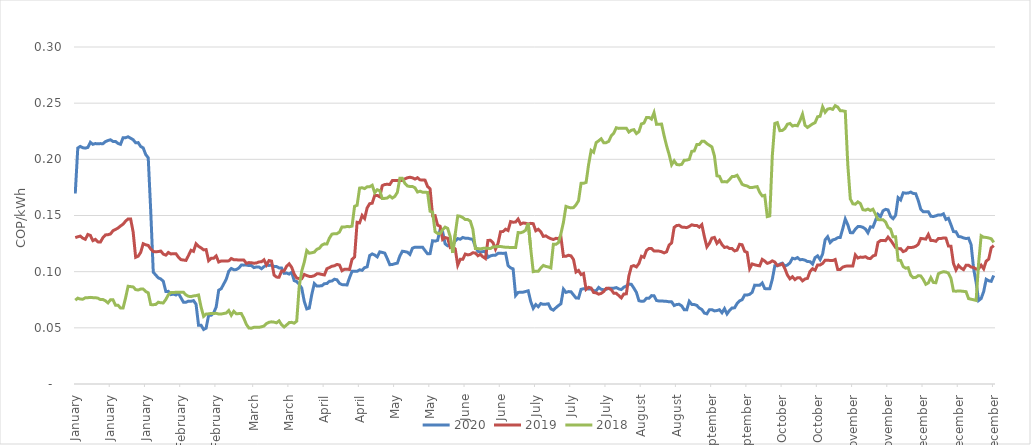
| Category | 2020 | 2019 | 2018 |
|---|---|---|---|
| 1900-01-01 | 0.17 | 0.13 | 0.075 |
| 1900-01-02 | 0.21 | 0.131 | 0.076 |
| 1900-01-03 | 0.212 | 0.132 | 0.076 |
| 1900-01-04 | 0.21 | 0.13 | 0.075 |
| 1900-01-05 | 0.21 | 0.129 | 0.077 |
| 1900-01-06 | 0.211 | 0.133 | 0.077 |
| 1900-01-07 | 0.215 | 0.132 | 0.077 |
| 1900-01-08 | 0.213 | 0.128 | 0.077 |
| 1900-01-09 | 0.214 | 0.129 | 0.077 |
| 1900-01-10 | 0.214 | 0.127 | 0.076 |
| 1900-01-11 | 0.214 | 0.126 | 0.075 |
| 1900-01-12 | 0.214 | 0.13 | 0.075 |
| 1900-01-13 | 0.216 | 0.133 | 0.074 |
| 1900-01-14 | 0.217 | 0.133 | 0.072 |
| 1900-01-15 | 0.217 | 0.134 | 0.075 |
| 1900-01-16 | 0.216 | 0.136 | 0.075 |
| 1900-01-17 | 0.216 | 0.138 | 0.07 |
| 1900-01-18 | 0.214 | 0.139 | 0.07 |
| 1900-01-19 | 0.213 | 0.141 | 0.068 |
| 1900-01-20 | 0.219 | 0.142 | 0.068 |
| 1900-01-21 | 0.219 | 0.145 | 0.077 |
| 1900-01-22 | 0.22 | 0.147 | 0.087 |
| 1900-01-23 | 0.219 | 0.147 | 0.087 |
| 1900-01-24 | 0.217 | 0.135 | 0.086 |
| 1900-01-25 | 0.215 | 0.113 | 0.084 |
| 1900-01-26 | 0.215 | 0.114 | 0.084 |
| 1900-01-27 | 0.211 | 0.117 | 0.084 |
| 1900-01-28 | 0.21 | 0.125 | 0.084 |
| 1900-01-29 | 0.204 | 0.124 | 0.082 |
| 1900-01-30 | 0.201 | 0.123 | 0.081 |
| 1900-01-31 | 0.154 | 0.12 | 0.071 |
| 1900-02-01 | 0.1 | 0.118 | 0.071 |
| 1900-02-02 | 0.097 | 0.118 | 0.071 |
| 1900-02-03 | 0.094 | 0.118 | 0.073 |
| 1900-02-04 | 0.093 | 0.118 | 0.072 |
| 1900-02-05 | 0.091 | 0.116 | 0.072 |
| 1900-02-06 | 0.082 | 0.115 | 0.075 |
| 1900-02-07 | 0.082 | 0.117 | 0.08 |
| 1900-02-08 | 0.08 | 0.116 | 0.081 |
| 1900-02-09 | 0.08 | 0.116 | 0.081 |
| 1900-02-10 | 0.079 | 0.116 | 0.082 |
| 1900-02-11 | 0.081 | 0.113 | 0.082 |
| 1900-02-12 | 0.077 | 0.111 | 0.082 |
| 1900-02-13 | 0.073 | 0.11 | 0.082 |
| 1900-02-14 | 0.073 | 0.11 | 0.079 |
| 1900-02-15 | 0.074 | 0.114 | 0.078 |
| 1900-02-16 | 0.074 | 0.119 | 0.078 |
| 1900-02-17 | 0.074 | 0.118 | 0.078 |
| 1900-02-18 | 0.071 | 0.125 | 0.079 |
| 1900-02-19 | 0.052 | 0.123 | 0.079 |
| 1900-02-20 | 0.052 | 0.121 | 0.068 |
| 1900-02-21 | 0.049 | 0.119 | 0.06 |
| 1900-02-22 | 0.05 | 0.12 | 0.062 |
| 1900-02-23 | 0.061 | 0.11 | 0.062 |
| 1900-02-24 | 0.061 | 0.112 | 0.063 |
| 1900-02-25 | 0.063 | 0.112 | 0.063 |
| 1900-02-26 | 0.069 | 0.114 | 0.063 |
| 1900-02-27 | 0.083 | 0.109 | 0.062 |
| 1900-02-28 | 0.085 | 0.109 | 0.062 |
| 1900-03-01 | 0.093 | 0.11 | 0.063 |
| 1900-03-02 | 0.1 | 0.11 | 0.065 |
| 1900-03-03 | 0.103 | 0.112 | 0.061 |
| 1900-03-04 | 0.102 | 0.111 | 0.065 |
| 1900-03-05 | 0.102 | 0.111 | 0.063 |
| 1900-03-06 | 0.103 | 0.11 | 0.063 |
| 1900-03-07 | 0.106 | 0.11 | 0.063 |
| 1900-03-08 | 0.106 | 0.11 | 0.058 |
| 1900-03-09 | 0.106 | 0.107 | 0.053 |
| 1900-03-10 | 0.105 | 0.108 | 0.05 |
| 1900-03-11 | 0.105 | 0.108 | 0.05 |
| 1900-03-12 | 0.104 | 0.108 | 0.05 |
| 1900-03-13 | 0.104 | 0.108 | 0.05 |
| 1900-03-14 | 0.104 | 0.109 | 0.05 |
| 1900-03-15 | 0.103 | 0.109 | 0.051 |
| 1900-03-16 | 0.104 | 0.111 | 0.052 |
| 1900-03-17 | 0.106 | 0.106 | 0.054 |
| 1900-03-18 | 0.106 | 0.11 | 0.055 |
| 1900-03-19 | 0.106 | 0.109 | 0.055 |
| 1900-03-20 | 0.105 | 0.097 | 0.055 |
| 1900-03-21 | 0.105 | 0.095 | 0.054 |
| 1900-03-22 | 0.103 | 0.095 | 0.056 |
| 1900-03-23 | 0.103 | 0.101 | 0.053 |
| 1900-03-24 | 0.099 | 0.101 | 0.051 |
| 1900-03-25 | 0.099 | 0.105 | 0.053 |
| 1900-03-26 | 0.098 | 0.107 | 0.055 |
| 1900-03-27 | 0.099 | 0.104 | 0.055 |
| 1900-03-28 | 0.092 | 0.098 | 0.054 |
| 1900-03-29 | 0.091 | 0.094 | 0.056 |
| 1900-03-30 | 0.089 | 0.094 | 0.087 |
| 1900-03-31 | 0.085 | 0.094 | 0.1 |
| 1900-04-01 | 0.074 | 0.098 | 0.108 |
| 1900-04-02 | 0.067 | 0.097 | 0.119 |
| 1900-04-03 | 0.068 | 0.096 | 0.116 |
| 1900-04-04 | 0.08 | 0.096 | 0.117 |
| 1900-04-05 | 0.089 | 0.096 | 0.117 |
| 1900-04-06 | 0.087 | 0.098 | 0.12 |
| 1900-04-07 | 0.087 | 0.098 | 0.121 |
| 1900-04-08 | 0.087 | 0.098 | 0.124 |
| 1900-04-09 | 0.089 | 0.097 | 0.125 |
| 1900-04-10 | 0.089 | 0.103 | 0.125 |
| 1900-04-11 | 0.091 | 0.104 | 0.13 |
| 1900-04-12 | 0.092 | 0.105 | 0.133 |
| 1900-04-13 | 0.093 | 0.105 | 0.134 |
| 1900-04-14 | 0.093 | 0.106 | 0.134 |
| 1900-04-15 | 0.09 | 0.106 | 0.135 |
| 1900-04-16 | 0.088 | 0.101 | 0.14 |
| 1900-04-17 | 0.088 | 0.102 | 0.14 |
| 1900-04-18 | 0.088 | 0.102 | 0.14 |
| 1900-04-19 | 0.095 | 0.102 | 0.14 |
| 1900-04-20 | 0.1 | 0.111 | 0.141 |
| 1900-04-21 | 0.1 | 0.113 | 0.158 |
| 1900-04-22 | 0.1 | 0.144 | 0.159 |
| 1900-04-23 | 0.102 | 0.143 | 0.174 |
| 1900-04-24 | 0.101 | 0.15 | 0.175 |
| 1900-04-25 | 0.104 | 0.147 | 0.174 |
| 1900-04-26 | 0.104 | 0.157 | 0.176 |
| 1900-04-27 | 0.114 | 0.161 | 0.176 |
| 1900-04-28 | 0.116 | 0.161 | 0.177 |
| 1900-04-29 | 0.115 | 0.168 | 0.17 |
| 1900-04-30 | 0.113 | 0.168 | 0.173 |
| 1900-05-01 | 0.118 | 0.167 | 0.172 |
| 1900-05-02 | 0.117 | 0.177 | 0.165 |
| 1900-05-03 | 0.117 | 0.178 | 0.165 |
| 1900-05-04 | 0.112 | 0.178 | 0.166 |
| 1900-05-05 | 0.106 | 0.178 | 0.167 |
| 1900-05-06 | 0.106 | 0.181 | 0.166 |
| 1900-05-07 | 0.107 | 0.181 | 0.167 |
| 1900-05-08 | 0.108 | 0.181 | 0.171 |
| 1900-05-09 | 0.114 | 0.181 | 0.183 |
| 1900-05-10 | 0.118 | 0.181 | 0.183 |
| 1900-05-11 | 0.118 | 0.183 | 0.179 |
| 1900-05-12 | 0.117 | 0.184 | 0.176 |
| 1900-05-13 | 0.115 | 0.184 | 0.176 |
| 1900-05-14 | 0.121 | 0.184 | 0.176 |
| 1900-05-15 | 0.122 | 0.182 | 0.175 |
| 1900-05-16 | 0.122 | 0.184 | 0.171 |
| 1900-05-17 | 0.122 | 0.182 | 0.172 |
| 1900-05-18 | 0.122 | 0.182 | 0.171 |
| 1900-05-19 | 0.119 | 0.181 | 0.171 |
| 1900-05-20 | 0.116 | 0.176 | 0.17 |
| 1900-05-21 | 0.116 | 0.174 | 0.154 |
| 1900-05-22 | 0.128 | 0.15 | 0.153 |
| 1900-05-23 | 0.127 | 0.15 | 0.136 |
| 1900-05-24 | 0.128 | 0.141 | 0.134 |
| 1900-05-25 | 0.138 | 0.14 | 0.134 |
| 1900-05-26 | 0.136 | 0.129 | 0.137 |
| 1900-05-27 | 0.125 | 0.13 | 0.14 |
| 1900-05-28 | 0.123 | 0.13 | 0.138 |
| 1900-05-29 | 0.124 | 0.122 | 0.131 |
| 1900-05-30 | 0.124 | 0.122 | 0.117 |
| 1900-05-31 | 0.127 | 0.12 | 0.134 |
| 1900-06-01 | 0.129 | 0.106 | 0.15 |
| 1900-06-02 | 0.129 | 0.111 | 0.149 |
| 1900-06-03 | 0.13 | 0.111 | 0.148 |
| 1900-06-04 | 0.13 | 0.116 | 0.146 |
| 1900-06-05 | 0.13 | 0.115 | 0.146 |
| 1900-06-06 | 0.129 | 0.115 | 0.145 |
| 1900-06-07 | 0.129 | 0.117 | 0.138 |
| 1900-06-08 | 0.122 | 0.117 | 0.121 |
| 1900-06-09 | 0.118 | 0.114 | 0.121 |
| 1900-06-10 | 0.118 | 0.115 | 0.12 |
| 1900-06-11 | 0.118 | 0.113 | 0.121 |
| 1900-06-12 | 0.118 | 0.112 | 0.121 |
| 1900-06-13 | 0.113 | 0.128 | 0.121 |
| 1900-06-14 | 0.114 | 0.128 | 0.121 |
| 1900-06-15 | 0.115 | 0.126 | 0.122 |
| 1900-06-16 | 0.115 | 0.12 | 0.122 |
| 1900-06-17 | 0.116 | 0.125 | 0.122 |
| 1900-06-18 | 0.116 | 0.136 | 0.122 |
| 1900-06-19 | 0.116 | 0.136 | 0.122 |
| 1900-06-20 | 0.117 | 0.138 | 0.122 |
| 1900-06-21 | 0.105 | 0.137 | 0.122 |
| 1900-06-22 | 0.103 | 0.145 | 0.121 |
| 1900-06-23 | 0.102 | 0.144 | 0.121 |
| 1900-06-24 | 0.079 | 0.144 | 0.121 |
| 1900-06-25 | 0.081 | 0.147 | 0.135 |
| 1900-06-26 | 0.082 | 0.142 | 0.135 |
| 1900-06-27 | 0.082 | 0.143 | 0.135 |
| 1900-06-28 | 0.082 | 0.143 | 0.137 |
| 1900-06-29 | 0.083 | 0.142 | 0.143 |
| 1900-06-30 | 0.073 | 0.143 | 0.12 |
| 1900-07-01 | 0.067 | 0.143 | 0.1 |
| 1900-07-02 | 0.071 | 0.136 | 0.1 |
| 1900-07-03 | 0.069 | 0.138 | 0.1 |
| 1900-07-04 | 0.072 | 0.136 | 0.103 |
| 1900-07-05 | 0.071 | 0.131 | 0.106 |
| 1900-07-06 | 0.071 | 0.132 | 0.105 |
| 1900-07-07 | 0.071 | 0.13 | 0.104 |
| 1900-07-08 | 0.067 | 0.129 | 0.103 |
| 1900-07-09 | 0.066 | 0.129 | 0.124 |
| 1900-07-10 | 0.068 | 0.13 | 0.124 |
| 1900-07-11 | 0.07 | 0.13 | 0.126 |
| 1900-07-12 | 0.071 | 0.131 | 0.134 |
| 1900-07-13 | 0.084 | 0.114 | 0.144 |
| 1900-07-14 | 0.082 | 0.114 | 0.158 |
| 1900-07-15 | 0.082 | 0.115 | 0.157 |
| 1900-07-16 | 0.082 | 0.114 | 0.157 |
| 1900-07-17 | 0.079 | 0.111 | 0.157 |
| 1900-07-18 | 0.076 | 0.1 | 0.16 |
| 1900-07-19 | 0.076 | 0.101 | 0.163 |
| 1900-07-20 | 0.084 | 0.097 | 0.179 |
| 1900-07-21 | 0.085 | 0.098 | 0.179 |
| 1900-07-22 | 0.085 | 0.084 | 0.179 |
| 1900-07-23 | 0.085 | 0.086 | 0.195 |
| 1900-07-24 | 0.085 | 0.085 | 0.208 |
| 1900-07-25 | 0.083 | 0.081 | 0.206 |
| 1900-07-26 | 0.083 | 0.081 | 0.215 |
| 1900-07-27 | 0.086 | 0.08 | 0.216 |
| 1900-07-28 | 0.084 | 0.081 | 0.218 |
| 1900-07-29 | 0.084 | 0.082 | 0.215 |
| 1900-07-30 | 0.084 | 0.085 | 0.215 |
| 1900-07-31 | 0.085 | 0.085 | 0.216 |
| 1900-08-01 | 0.085 | 0.084 | 0.221 |
| 1900-08-02 | 0.085 | 0.081 | 0.223 |
| 1900-08-03 | 0.086 | 0.081 | 0.228 |
| 1900-08-04 | 0.085 | 0.079 | 0.228 |
| 1900-08-05 | 0.084 | 0.077 | 0.228 |
| 1900-08-06 | 0.086 | 0.08 | 0.228 |
| 1900-08-07 | 0.087 | 0.08 | 0.228 |
| 1900-08-08 | 0.089 | 0.096 | 0.224 |
| 1900-08-09 | 0.089 | 0.105 | 0.226 |
| 1900-08-10 | 0.085 | 0.105 | 0.226 |
| 1900-08-11 | 0.082 | 0.104 | 0.223 |
| 1900-08-12 | 0.074 | 0.107 | 0.225 |
| 1900-08-13 | 0.074 | 0.114 | 0.232 |
| 1900-08-14 | 0.074 | 0.113 | 0.232 |
| 1900-08-15 | 0.076 | 0.119 | 0.237 |
| 1900-08-16 | 0.076 | 0.121 | 0.237 |
| 1900-08-17 | 0.079 | 0.121 | 0.236 |
| 1900-08-18 | 0.079 | 0.118 | 0.242 |
| 1900-08-19 | 0.074 | 0.118 | 0.231 |
| 1900-08-20 | 0.074 | 0.118 | 0.231 |
| 1900-08-21 | 0.074 | 0.118 | 0.231 |
| 1900-08-22 | 0.074 | 0.117 | 0.221 |
| 1900-08-23 | 0.074 | 0.118 | 0.212 |
| 1900-08-24 | 0.073 | 0.124 | 0.204 |
| 1900-08-25 | 0.073 | 0.126 | 0.195 |
| 1900-08-26 | 0.07 | 0.139 | 0.199 |
| 1900-08-27 | 0.071 | 0.141 | 0.195 |
| 1900-08-28 | 0.071 | 0.141 | 0.195 |
| 1900-08-29 | 0.069 | 0.14 | 0.196 |
| 1900-08-30 | 0.066 | 0.14 | 0.199 |
| 1900-08-31 | 0.066 | 0.139 | 0.199 |
| 1900-09-01 | 0.074 | 0.14 | 0.2 |
| 1900-09-02 | 0.071 | 0.142 | 0.207 |
| 1900-09-03 | 0.071 | 0.141 | 0.207 |
| 1900-09-04 | 0.07 | 0.141 | 0.213 |
| 1900-09-05 | 0.068 | 0.14 | 0.213 |
| 1900-09-06 | 0.066 | 0.142 | 0.216 |
| 1900-09-07 | 0.063 | 0.131 | 0.216 |
| 1900-09-08 | 0.062 | 0.122 | 0.214 |
| 1900-09-09 | 0.066 | 0.125 | 0.213 |
| 1900-09-10 | 0.066 | 0.13 | 0.211 |
| 1900-09-11 | 0.065 | 0.13 | 0.203 |
| 1900-09-12 | 0.065 | 0.125 | 0.185 |
| 1900-09-13 | 0.066 | 0.128 | 0.185 |
| 1900-09-14 | 0.063 | 0.124 | 0.18 |
| 1900-09-15 | 0.067 | 0.122 | 0.18 |
| 1900-09-16 | 0.062 | 0.122 | 0.18 |
| 1900-09-17 | 0.066 | 0.121 | 0.182 |
| 1900-09-18 | 0.068 | 0.121 | 0.185 |
| 1900-09-19 | 0.068 | 0.118 | 0.185 |
| 1900-09-20 | 0.072 | 0.119 | 0.186 |
| 1900-09-21 | 0.074 | 0.124 | 0.182 |
| 1900-09-22 | 0.075 | 0.124 | 0.178 |
| 1900-09-23 | 0.079 | 0.118 | 0.177 |
| 1900-09-24 | 0.079 | 0.117 | 0.176 |
| 1900-09-25 | 0.08 | 0.103 | 0.175 |
| 1900-09-26 | 0.082 | 0.107 | 0.175 |
| 1900-09-27 | 0.088 | 0.106 | 0.175 |
| 1900-09-28 | 0.088 | 0.106 | 0.176 |
| 1900-09-29 | 0.088 | 0.105 | 0.171 |
| 1900-09-30 | 0.09 | 0.111 | 0.167 |
| 1900-10-01 | 0.085 | 0.109 | 0.168 |
| 1900-10-02 | 0.085 | 0.107 | 0.149 |
| 1900-10-03 | 0.085 | 0.108 | 0.15 |
| 1900-10-04 | 0.093 | 0.11 | 0.203 |
| 1900-10-05 | 0.105 | 0.109 | 0.232 |
| 1900-10-06 | 0.105 | 0.106 | 0.233 |
| 1900-10-07 | 0.107 | 0.106 | 0.226 |
| 1900-10-08 | 0.108 | 0.107 | 0.226 |
| 1900-10-09 | 0.105 | 0.103 | 0.227 |
| 1900-10-10 | 0.106 | 0.097 | 0.231 |
| 1900-10-11 | 0.108 | 0.094 | 0.232 |
| 1900-10-12 | 0.112 | 0.095 | 0.23 |
| 1900-10-13 | 0.111 | 0.093 | 0.23 |
| 1900-10-14 | 0.113 | 0.095 | 0.23 |
| 1900-10-15 | 0.111 | 0.095 | 0.234 |
| 1900-10-16 | 0.111 | 0.092 | 0.24 |
| 1900-10-17 | 0.11 | 0.093 | 0.23 |
| 1900-10-18 | 0.109 | 0.094 | 0.228 |
| 1900-10-19 | 0.109 | 0.1 | 0.23 |
| 1900-10-20 | 0.107 | 0.103 | 0.232 |
| 1900-10-21 | 0.113 | 0.101 | 0.233 |
| 1900-10-22 | 0.114 | 0.106 | 0.238 |
| 1900-10-23 | 0.111 | 0.106 | 0.238 |
| 1900-10-24 | 0.116 | 0.107 | 0.247 |
| 1900-10-25 | 0.128 | 0.11 | 0.242 |
| 1900-10-26 | 0.131 | 0.11 | 0.245 |
| 1900-10-27 | 0.126 | 0.11 | 0.245 |
| 1900-10-28 | 0.128 | 0.11 | 0.244 |
| 1900-10-29 | 0.129 | 0.111 | 0.248 |
| 1900-10-30 | 0.13 | 0.102 | 0.247 |
| 1900-10-31 | 0.13 | 0.102 | 0.243 |
| 1900-11-01 | 0.138 | 0.104 | 0.243 |
| 1900-11-02 | 0.147 | 0.105 | 0.243 |
| 1900-11-03 | 0.142 | 0.105 | 0.195 |
| 1900-11-04 | 0.135 | 0.105 | 0.165 |
| 1900-11-05 | 0.135 | 0.105 | 0.16 |
| 1900-11-06 | 0.138 | 0.115 | 0.16 |
| 1900-11-07 | 0.14 | 0.112 | 0.162 |
| 1900-11-08 | 0.14 | 0.113 | 0.161 |
| 1900-11-09 | 0.139 | 0.113 | 0.155 |
| 1900-11-10 | 0.138 | 0.113 | 0.155 |
| 1900-11-11 | 0.135 | 0.112 | 0.156 |
| 1900-11-12 | 0.14 | 0.112 | 0.154 |
| 1900-11-13 | 0.14 | 0.114 | 0.156 |
| 1900-11-14 | 0.146 | 0.115 | 0.151 |
| 1900-11-15 | 0.151 | 0.126 | 0.146 |
| 1900-11-16 | 0.149 | 0.128 | 0.146 |
| 1900-11-17 | 0.154 | 0.128 | 0.146 |
| 1900-11-18 | 0.155 | 0.128 | 0.144 |
| 1900-11-19 | 0.155 | 0.131 | 0.139 |
| 1900-11-20 | 0.149 | 0.128 | 0.138 |
| 1900-11-21 | 0.147 | 0.125 | 0.131 |
| 1900-11-22 | 0.15 | 0.121 | 0.131 |
| 1900-11-23 | 0.166 | 0.12 | 0.11 |
| 1900-11-24 | 0.164 | 0.121 | 0.11 |
| 1900-11-25 | 0.17 | 0.118 | 0.105 |
| 1900-11-26 | 0.17 | 0.119 | 0.103 |
| 1900-11-27 | 0.17 | 0.122 | 0.104 |
| 1900-11-28 | 0.171 | 0.121 | 0.097 |
| 1900-11-29 | 0.17 | 0.122 | 0.095 |
| 1900-11-30 | 0.169 | 0.123 | 0.095 |
| 1900-12-01 | 0.163 | 0.124 | 0.096 |
| 1900-12-02 | 0.156 | 0.13 | 0.096 |
| 1900-12-03 | 0.153 | 0.129 | 0.093 |
| 1900-12-04 | 0.153 | 0.129 | 0.089 |
| 1900-12-05 | 0.153 | 0.133 | 0.09 |
| 1900-12-06 | 0.149 | 0.128 | 0.095 |
| 1900-12-07 | 0.149 | 0.128 | 0.09 |
| 1900-12-08 | 0.15 | 0.127 | 0.09 |
| 1900-12-09 | 0.151 | 0.13 | 0.098 |
| 1900-12-10 | 0.15 | 0.129 | 0.099 |
| 1900-12-11 | 0.152 | 0.13 | 0.1 |
| 1900-12-12 | 0.146 | 0.13 | 0.1 |
| 1900-12-13 | 0.148 | 0.123 | 0.099 |
| 1900-12-14 | 0.142 | 0.123 | 0.094 |
| 1900-12-15 | 0.136 | 0.107 | 0.083 |
| 1900-12-16 | 0.136 | 0.102 | 0.083 |
| 1900-12-17 | 0.131 | 0.106 | 0.083 |
| 1900-12-18 | 0.131 | 0.103 | 0.083 |
| 1900-12-19 | 0.13 | 0.102 | 0.082 |
| 1900-12-20 | 0.129 | 0.106 | 0.082 |
| 1900-12-21 | 0.13 | 0.106 | 0.076 |
| 1900-12-22 | 0.124 | 0.104 | 0.075 |
| 1900-12-23 | 0.103 | 0.104 | 0.075 |
| 1900-12-24 | 0.09 | 0.102 | 0.074 |
| 1900-12-25 | 0.074 | 0.103 | 0.108 |
| 1900-12-26 | 0.076 | 0.106 | 0.132 |
| 1900-12-27 | 0.082 | 0.103 | 0.131 |
| 1900-12-28 | 0.093 | 0.109 | 0.131 |
| 1900-12-29 | 0.092 | 0.111 | 0.13 |
| 1900-12-30 | 0.091 | 0.121 | 0.129 |
| 1900-12-31 | 0.097 | 0.123 | 0.126 |